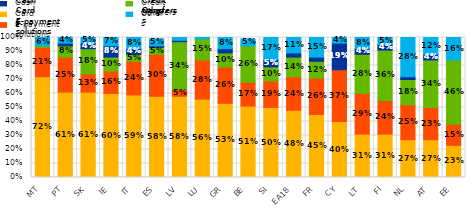
| Category | Cards | E-payment solutions | Credit transfers | Cash  | Others |
|---|---|---|---|---|---|
| MT | 0.72 | 0.21 | 0.01 | 0 | 0.06 |
| PT | 0.61 | 0.25 | 0.08 | 0.02 | 0.04 |
| SK | 0.61 | 0.13 | 0.18 | 0.04 | 0.05 |
| IE | 0.6 | 0.16 | 0.1 | 0.08 | 0.07 |
| IT | 0.59 | 0.24 | 0.05 | 0.04 | 0.08 |
| ES | 0.58 | 0.3 | 0.05 | 0.01 | 0.05 |
| LV | 0.58 | 0.05 | 0.34 | 0.01 | 0.03 |
| LU | 0.56 | 0.28 | 0.15 | 0 | 0.01 |
| GR | 0.53 | 0.26 | 0.1 | 0.03 | 0.08 |
| BE | 0.51 | 0.17 | 0.26 | 0 | 0.05 |
| SI | 0.5 | 0.19 | 0.1 | 0.05 | 0.17 |
| EA18 | 0.48 | 0.24 | 0.14 | 0.03 | 0.11 |
| FR | 0.45 | 0.26 | 0.12 | 0.03 | 0.15 |
| CY | 0.4 | 0.37 | 0 | 0.19 | 0.04 |
| LT | 0.31 | 0.29 | 0.28 | 0.04 | 0.08 |
| FI | 0.31 | 0.24 | 0.36 | 0.04 | 0.05 |
| NL | 0.27 | 0.25 | 0.18 | 0.02 | 0.28 |
| AT | 0.27 | 0.23 | 0.34 | 0.04 | 0.12 |
| EE | 0.23 | 0.15 | 0.46 | 0 | 0.16 |